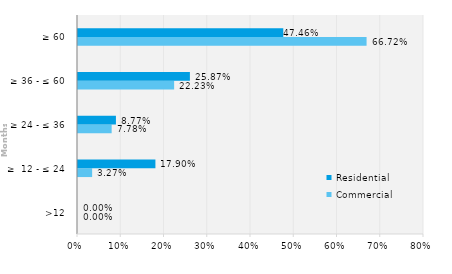
| Category | Commercial | Residential |
|---|---|---|
| >12 | 0 | 0 |
| ≥  12 - ≤ 24 | 0.033 | 0.179 |
| ≥ 24 - ≤ 36 | 0.078 | 0.088 |
| ≥ 36 - ≤ 60 | 0.222 | 0.259 |
| ≥ 60 | 0.667 | 0.475 |